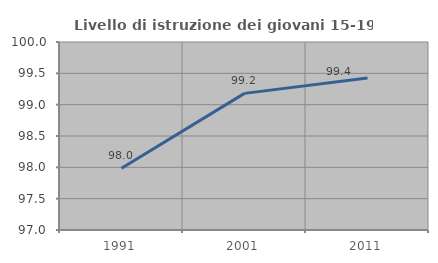
| Category | Livello di istruzione dei giovani 15-19 anni |
|---|---|
| 1991.0 | 97.987 |
| 2001.0 | 99.18 |
| 2011.0 | 99.425 |